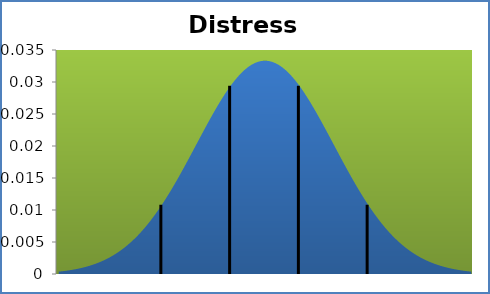
| Category | densité |
|---|---|
| 5.739999999999995 | 0 |
| 6.338499999999996 | 0 |
| 6.936999999999998 | 0 |
| 7.535499999999992 | 0.001 |
| 8.133999999999993 | 0.001 |
| 8.732499999999995 | 0.001 |
| 9.330999999999996 | 0.001 |
| 9.929499999999994 | 0.001 |
| 10.527999999999995 | 0.001 |
| 11.126499999999997 | 0.001 |
| 11.724999999999998 | 0.001 |
| 12.323499999999996 | 0.002 |
| 12.921999999999997 | 0.002 |
| 13.520499999999998 | 0.002 |
| 14.119 | 0.002 |
| 14.717500000000001 | 0.003 |
| 15.315999999999995 | 0.003 |
| 15.914499999999997 | 0.003 |
| 16.512999999999998 | 0.004 |
| 17.111499999999996 | 0.004 |
| 17.709999999999997 | 0.005 |
| 18.308499999999995 | 0.005 |
| 18.906999999999996 | 0.005 |
| 19.505499999999998 | 0.006 |
| 20.104 | 0.007 |
| 20.702499999999997 | 0.007 |
| 21.301 | 0.008 |
| 21.899499999999996 | 0.009 |
| 22.497999999999998 | 0.009 |
| 23.0965 | 0.01 |
| 23.694999999999997 | 0.011 |
| 24.293499999999998 | 0.012 |
| 24.891999999999996 | 0.013 |
| 25.490499999999997 | 0.013 |
| 26.089 | 0.014 |
| 26.6875 | 0.015 |
| 27.285999999999998 | 0.016 |
| 27.8845 | 0.017 |
| 28.482999999999997 | 0.018 |
| 29.0815 | 0.019 |
| 29.68 | 0.02 |
| 30.278499999999998 | 0.021 |
| 30.877 | 0.022 |
| 31.475499999999997 | 0.023 |
| 32.074 | 0.024 |
| 32.6725 | 0.025 |
| 33.271 | 0.026 |
| 33.869499999999995 | 0.027 |
| 34.467999999999996 | 0.028 |
| 35.0665 | 0.029 |
| 35.665 | 0.029 |
| 36.2635 | 0.03 |
| 36.861999999999995 | 0.031 |
| 37.460499999999996 | 0.031 |
| 38.059 | 0.032 |
| 38.6575 | 0.032 |
| 39.256 | 0.033 |
| 39.8545 | 0.033 |
| 40.452999999999996 | 0.033 |
| 41.0515 | 0.033 |
| 41.65 | 0.033 |
| 42.2485 | 0.033 |
| 42.847 | 0.033 |
| 43.445499999999996 | 0.033 |
| 44.044 | 0.033 |
| 44.6425 | 0.032 |
| 45.241 | 0.032 |
| 45.8395 | 0.031 |
| 46.438 | 0.031 |
| 47.0365 | 0.03 |
| 47.635 | 0.029 |
| 48.2335 | 0.029 |
| 48.832 | 0.028 |
| 49.4305 | 0.027 |
| 50.028999999999996 | 0.026 |
| 50.6275 | 0.025 |
| 51.226 | 0.024 |
| 51.8245 | 0.023 |
| 52.423 | 0.022 |
| 53.0215 | 0.021 |
| 53.62 | 0.02 |
| 54.2185 | 0.019 |
| 54.817 | 0.018 |
| 55.415499999999994 | 0.017 |
| 56.013999999999996 | 0.016 |
| 56.6125 | 0.015 |
| 57.211 | 0.014 |
| 57.8095 | 0.013 |
| 58.408 | 0.013 |
| 59.0065 | 0.012 |
| 59.605000000000004 | 0.011 |
| 60.2035 | 0.01 |
| 60.802 | 0.009 |
| 61.4005 | 0.009 |
| 61.998999999999995 | 0.008 |
| 62.5975 | 0.007 |
| 63.196 | 0.007 |
| 63.7945 | 0.006 |
| 64.393 | 0.005 |
| 64.9915 | 0.005 |
| 65.59 | 0.005 |
| 66.1885 | 0.004 |
| 66.787 | 0.004 |
| 67.38550000000001 | 0.003 |
| 67.98400000000001 | 0.003 |
| 68.5825 | 0.003 |
| 69.181 | 0.002 |
| 69.7795 | 0.002 |
| 70.378 | 0.002 |
| 70.9765 | 0.002 |
| 71.575 | 0.001 |
| 72.1735 | 0.001 |
| 72.772 | 0.001 |
| 73.3705 | 0.001 |
| 73.969 | 0.001 |
| 74.5675 | 0.001 |
| 75.166 | 0.001 |
| 75.7645 | 0.001 |
| 76.363 | 0 |
| 76.9615 | 0 |
| 77.56 | 0 |